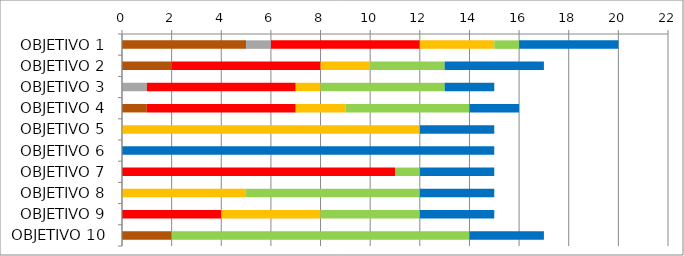
| Category | Series 0 | Series 1 | Series 2 | Series 3 | Series 4 | Series 5 |
|---|---|---|---|---|---|---|
| OBJETIVO 1 | 5 | 1 | 6 | 3 | 1 | 4 |
| OBJETIVO 2 | 2 | 0 | 6 | 2 | 3 | 4 |
| OBJETIVO 3 | 0 | 1 | 6 | 1 | 5 | 2 |
| OBJETIVO 4 | 1 | 0 | 6 | 2 | 5 | 2 |
| OBJETIVO 5 | 0 | 0 | 0 | 12 | 0 | 3 |
| OBJETIVO 6 | 0 | 0 | 0 | 0 | 0 | 15 |
| OBJETIVO 7 | 0 | 0 | 11 | 0 | 1 | 3 |
| OBJETIVO 8 | 0 | 0 | 0 | 5 | 7 | 3 |
| OBJETIVO 9 | 0 | 0 | 4 | 4 | 4 | 3 |
| OBJETIVO 10 | 2 | 0 | 0 | 0 | 12 | 3 |